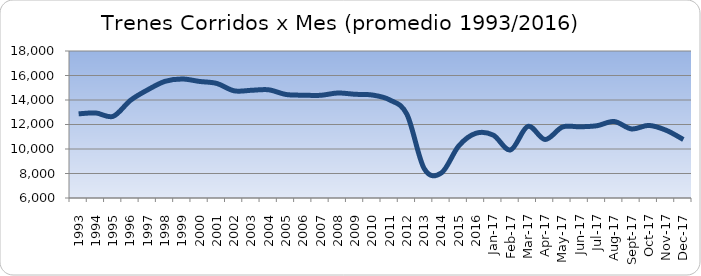
| Category | Series 0 |
|---|---|
| 1993.0 | 12869.333 |
| 1994.0 | 12940.333 |
| 1995.0 | 12668.75 |
| 1996.0 | 13973.667 |
| 1997.0 | 14832.917 |
| 1998.0 | 15523.333 |
| 1999.0 | 15713 |
| 2000.0 | 15515.083 |
| 2001.0 | 15350.083 |
| 2002.0 | 14749 |
| 2003.0 | 14792.417 |
| 2004.0 | 14832.75 |
| 2005.0 | 14450.25 |
| 2006.0 | 14394.333 |
| 2007.0 | 14382.333 |
| 2008.0 | 14571.333 |
| 2009.0 | 14466.75 |
| 2010.0 | 14406 |
| 2011.0 | 14009.75 |
| 2012.0 | 12831.083 |
| 2013.0 | 8399.583 |
| 2014.0 | 8052.667 |
| 2015.0 | 10252.917 |
| 2016.0 | 11287 |
| 42736.0 | 11131 |
| 42767.0 | 9925 |
| 42795.0 | 11846 |
| 42826.0 | 10775 |
| 42856.0 | 11796 |
| 42887.0 | 11813 |
| 42917.0 | 11900 |
| 42948.0 | 12243 |
| 42979.0 | 11638 |
| 43009.0 | 11926 |
| 43040.0 | 11532 |
| 43070.0 | 10774 |